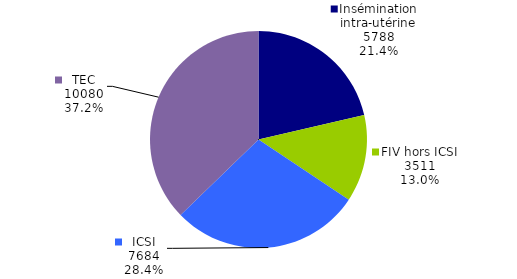
| Category | Enfants nés vivants |
|---|---|
| Insémination intra-utérine | 5788 |
| FIV hors ICSI | 3511 |
| ICSI | 7684 |
| TEC | 10080 |